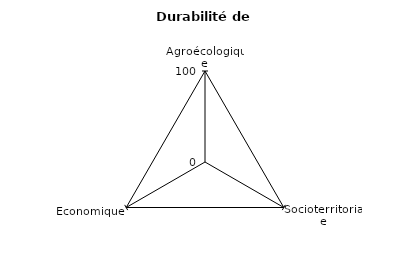
| Category | Maximum | Valeur de 
l'exploitation |
|---|---|---|
| Agroécologique | 100 | 0 |
| Socioterritoriale | 100 | 0 |
| Economique | 100 | 0 |